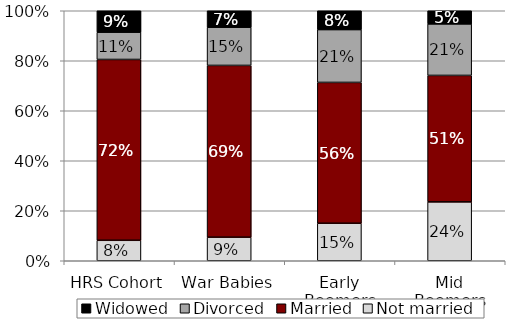
| Category | Not married | Married | Divorced | Widowed |
|---|---|---|---|---|
| HRS Cohort | 0.082 | 0.723 | 0.109 | 0.086 |
| War Babies | 0.094 | 0.687 | 0.153 | 0.066 |
| Early Boomers | 0.15 | 0.563 | 0.211 | 0.075 |
| Mid Boomers | 0.235 | 0.506 | 0.206 | 0.053 |